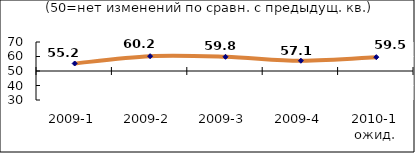
| Category | Диф.индекс ↓ |
|---|---|
| 2009-1 | 55.175 |
| 2009-2 | 60.22 |
| 2009-3 | 59.79 |
| 2009-4 | 57.085 |
| 2010-1 ожид. | 59.54 |